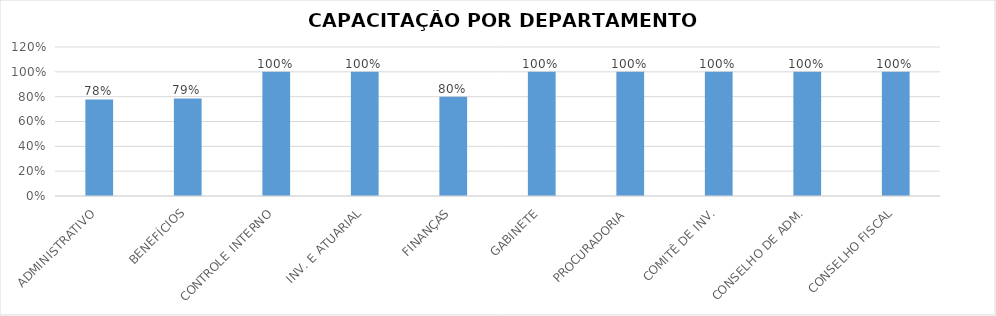
| Category | Series 0 |
|---|---|
| ADMINISTRATIVO | 0.778 |
| BENEFÍCIOS | 0.786 |
| CONTROLE INTERNO | 1 |
| INV. E ATUARIAL | 1 |
| FINANÇAS | 0.8 |
| GABINETE | 1 |
| PROCURADORIA | 1 |
| COMITÊ DE INV. | 1 |
| CONSELHO DE ADM. | 1 |
| CONSELHO FISCAL | 1 |